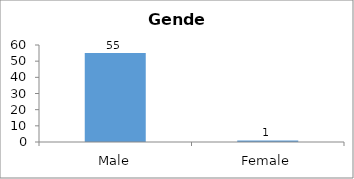
| Category | Gender |
|---|---|
| Male | 55 |
| Female | 1 |